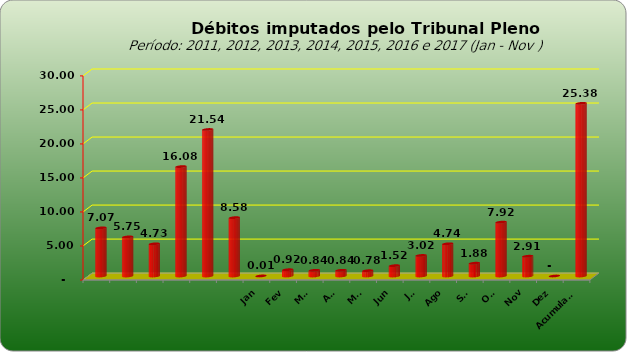
| Category |  7.073.154,74  |
|---|---|
|  | 7073154.74 |
|  | 5749129.25 |
|  | 4727033.51 |
|  | 16081820.48 |
|  | 21535723.6 |
|  | 8578266.09 |
| Jan | 7518 |
| Fev | 924330.96 |
| Mar | 840781.7 |
| Abr | 842058.28 |
| Mai | 780852.82 |
| Jun | 1521029.64 |
| Jul | 3021280.99 |
| Ago | 4735560.75 |
| Set | 1882202.79 |
| Out | 7918420.36 |
| Nov | 2906996.01 |
| Dez | 0 |
| Acumulado | 25381032.3 |